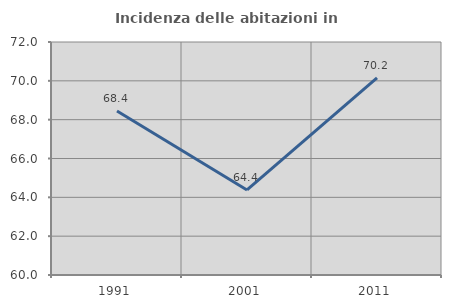
| Category | Incidenza delle abitazioni in proprietà  |
|---|---|
| 1991.0 | 68.443 |
| 2001.0 | 64.38 |
| 2011.0 | 70.152 |